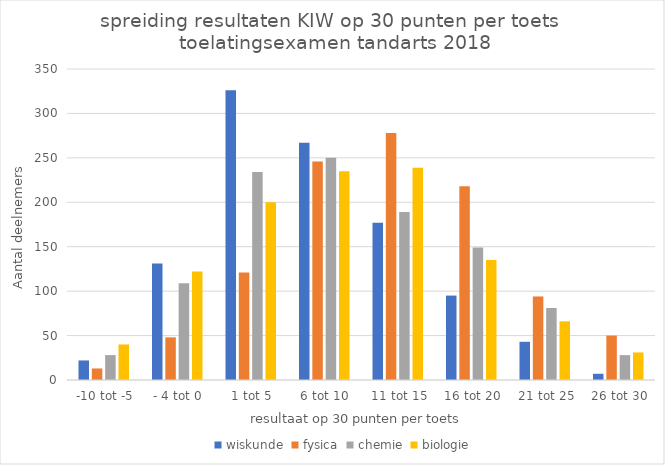
| Category | wiskunde | fysica | chemie | biologie |
|---|---|---|---|---|
|  -10 tot -5 | 22 | 13 | 28 | 40 |
|  - 4 tot 0 | 131 | 48 | 109 | 122 |
|  1 tot 5 | 326 | 121 | 234 | 200 |
|  6 tot 10 | 267 | 246 | 250 | 235 |
|  11 tot 15 | 177 | 278 | 189 | 239 |
|  16 tot 20 | 95 | 218 | 149 | 135 |
|  21 tot 25 | 43 | 94 | 81 | 66 |
|  26 tot 30 | 7 | 50 | 28 | 31 |